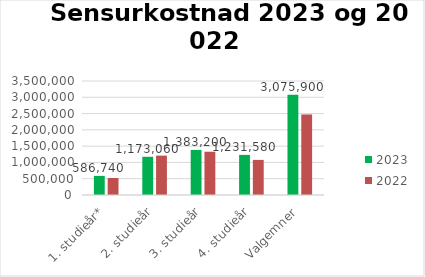
| Category | 2023 | 2022 |
|---|---|---|
| 1. studieår* | 586740 | 521360 |
| 2. studieår | 1173060 | 1209040 |
| 3. studieår | 1383200 | 1327800 |
| 4. studieår | 1231580 | 1077240 |
| Valgemner | 3075900 | 2472300 |